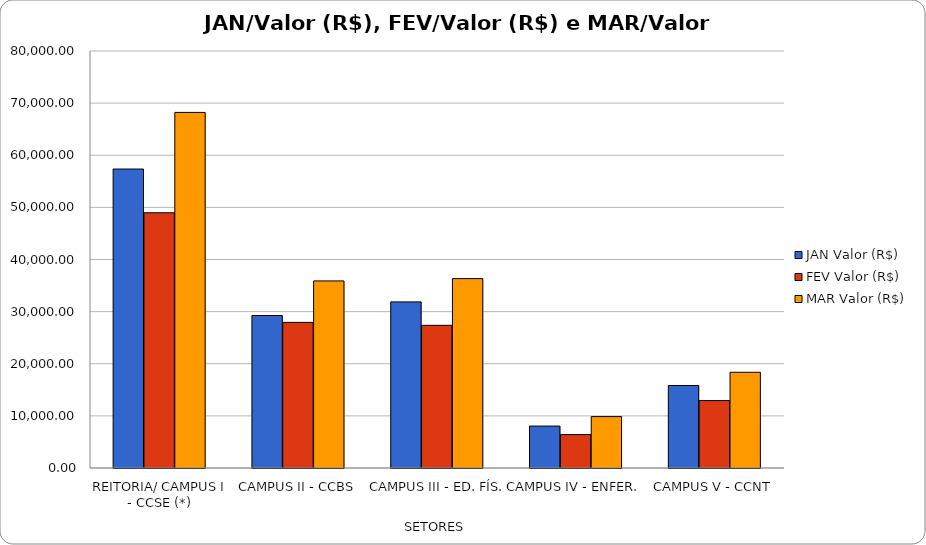
| Category | JAN | FEV | MAR |
|---|---|---|---|
| REITORIA/ CAMPUS I - CCSE (*) | 57354.12 | 48968.44 | 68219.36 |
| CAMPUS II - CCBS | 29251.27 | 27936.05 | 35893.14 |
| CAMPUS III - ED. FÍS. | 31869.45 | 27372.47 | 36332 |
| CAMPUS IV - ENFER. | 8041.8 | 6408.04 | 9860.91 |
| CAMPUS V - CCNT | 15821.09 | 12943.16 | 18363.64 |